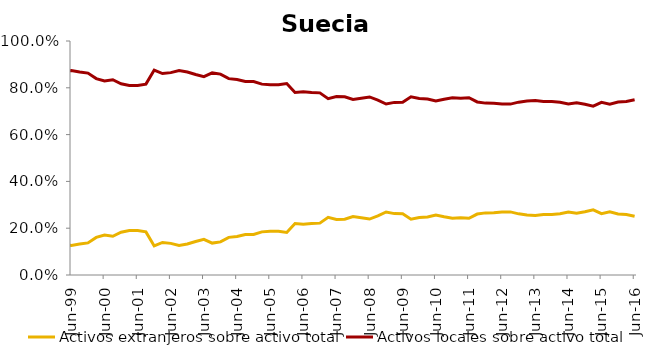
| Category | Activos extranjeros sobre activo total | Activos locales sobre activo total |
|---|---|---|
| 1999-03-01 | 0.132 | 0.868 |
| 1999-06-01 | 0.127 | 0.873 |
| 1999-09-01 | 0.132 | 0.868 |
| 1999-12-01 | 0.137 | 0.863 |
| 2000-03-01 | 0.161 | 0.839 |
| 2000-06-01 | 0.171 | 0.829 |
| 2000-09-01 | 0.166 | 0.834 |
| 2000-12-01 | 0.183 | 0.817 |
| 2001-03-01 | 0.19 | 0.81 |
| 2001-06-01 | 0.19 | 0.81 |
| 2001-09-01 | 0.184 | 0.816 |
| 2001-12-01 | 0.124 | 0.876 |
| 2002-03-01 | 0.139 | 0.861 |
| 2002-06-01 | 0.135 | 0.865 |
| 2002-09-01 | 0.126 | 0.874 |
| 2002-12-01 | 0.133 | 0.867 |
| 2003-03-01 | 0.143 | 0.857 |
| 2003-06-01 | 0.152 | 0.848 |
| 2003-09-01 | 0.136 | 0.864 |
| 2003-12-01 | 0.141 | 0.859 |
| 2004-03-01 | 0.161 | 0.839 |
| 2004-06-01 | 0.165 | 0.835 |
| 2004-09-01 | 0.173 | 0.827 |
| 2004-12-01 | 0.173 | 0.827 |
| 2005-03-01 | 0.184 | 0.816 |
| 2005-06-01 | 0.187 | 0.813 |
| 2005-09-01 | 0.187 | 0.813 |
| 2005-12-01 | 0.182 | 0.818 |
| 2006-03-01 | 0.22 | 0.78 |
| 2006-06-01 | 0.216 | 0.784 |
| 2006-09-01 | 0.22 | 0.78 |
| 2006-12-01 | 0.222 | 0.778 |
| 2007-03-01 | 0.246 | 0.754 |
| 2007-06-01 | 0.238 | 0.762 |
| 2007-09-01 | 0.238 | 0.762 |
| 2007-12-01 | 0.25 | 0.75 |
| 2008-03-01 | 0.244 | 0.756 |
| 2008-06-01 | 0.239 | 0.761 |
| 2008-09-01 | 0.252 | 0.748 |
| 2008-12-01 | 0.269 | 0.731 |
| 2009-03-01 | 0.262 | 0.738 |
| 2009-06-01 | 0.262 | 0.738 |
| 2009-09-01 | 0.239 | 0.761 |
| 2009-12-01 | 0.245 | 0.755 |
| 2010-03-01 | 0.248 | 0.752 |
| 2010-06-01 | 0.257 | 0.743 |
| 2010-09-01 | 0.249 | 0.751 |
| 2010-12-01 | 0.243 | 0.757 |
| 2011-03-01 | 0.245 | 0.755 |
| 2011-06-01 | 0.242 | 0.758 |
| 2011-09-01 | 0.26 | 0.74 |
| 2011-12-01 | 0.265 | 0.735 |
| 2012-03-01 | 0.266 | 0.734 |
| 2012-06-01 | 0.269 | 0.731 |
| 2012-09-01 | 0.27 | 0.73 |
| 2012-12-01 | 0.261 | 0.739 |
| 2013-03-01 | 0.256 | 0.744 |
| 2013-06-01 | 0.255 | 0.745 |
| 2013-09-01 | 0.259 | 0.741 |
| 2013-12-01 | 0.259 | 0.741 |
| 2014-03-01 | 0.262 | 0.738 |
| 2014-06-01 | 0.269 | 0.731 |
| 2014-09-01 | 0.264 | 0.736 |
| 2014-12-01 | 0.27 | 0.73 |
| 2015-03-01 | 0.278 | 0.722 |
| 2015-06-01 | 0.262 | 0.738 |
| 2015-09-01 | 0.27 | 0.73 |
| 2015-12-01 | 0.261 | 0.739 |
| 2016-03-01 | 0.259 | 0.741 |
| 2016-06-01 | 0.251 | 0.749 |